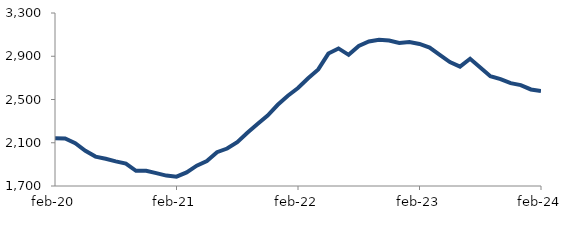
| Category | Series 0 |
|---|---|
| 2020-02-01 | 2141.715 |
| 2020-03-01 | 2140.312 |
| 2020-04-01 | 2095.806 |
| 2020-05-01 | 2025.041 |
| 2020-06-01 | 1971.807 |
| 2020-07-01 | 1951.466 |
| 2020-08-01 | 1927.763 |
| 2020-09-01 | 1907.078 |
| 2020-10-01 | 1840.778 |
| 2020-11-01 | 1841.166 |
| 2020-12-01 | 1819.546 |
| 2021-01-01 | 1796.45 |
| 2021-02-01 | 1786.603 |
| 2021-03-01 | 1826.072 |
| 2021-04-01 | 1887.798 |
| 2021-05-01 | 1930.372 |
| 2021-06-01 | 2012.926 |
| 2021-07-01 | 2046.434 |
| 2021-08-01 | 2105.806 |
| 2021-09-01 | 2192.514 |
| 2021-10-01 | 2272.972 |
| 2021-11-01 | 2351.334 |
| 2021-12-01 | 2451.171 |
| 2022-01-01 | 2534.613 |
| 2022-02-01 | 2606.357 |
| 2022-03-01 | 2696.948 |
| 2022-04-01 | 2778.264 |
| 2022-05-01 | 2924.682 |
| 2022-06-01 | 2972.281 |
| 2022-07-01 | 2912.933 |
| 2022-08-01 | 2994.913 |
| 2022-09-01 | 3036.467 |
| 2022-10-01 | 3052.236 |
| 2022-11-01 | 3044.767 |
| 2022-12-01 | 3023.141 |
| 2023-01-01 | 3030.956 |
| 2023-02-01 | 3013.674 |
| 2023-03-01 | 2979.861 |
| 2023-04-01 | 2913.014 |
| 2023-05-01 | 2845.832 |
| 2023-06-01 | 2803.594 |
| 2023-07-01 | 2876.7 |
| 2023-08-01 | 2796.297 |
| 2023-09-01 | 2715.691 |
| 2023-10-01 | 2689.066 |
| 2023-11-01 | 2650.837 |
| 2023-12-01 | 2633.487 |
| 2024-01-01 | 2592.905 |
| 2024-02-01 | 2578.01 |